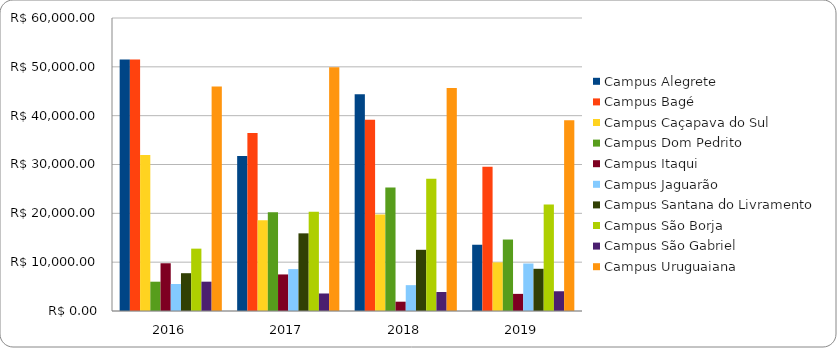
| Category | Campus Alegrete | Campus Bagé | Campus Caçapava do Sul | Campus Dom Pedrito | Campus Itaqui | Campus Jaguarão | Campus Santana do Livramento | Campus São Borja | Campus São Gabriel | Campus Uruguaiana |
|---|---|---|---|---|---|---|---|---|---|---|
| 2016.0 | 51503.28 | 51503.28 | 31923.03 | 6000.3 | 9774.9 | 5524.56 | 7741.78 | 12768.87 | 6005.07 | 45958.79 |
| 2017.0 | 31750.05 | 36445.28 | 18592.67 | 20207.49 | 7486.68 | 8578.61 | 15900.46 | 20317.83 | 3586.74 | 49914.33 |
| 2018.0 | 44397.16 | 39189.39 | 19756.82 | 25306.79 | 1905.09 | 5292.72 | 12533.12 | 27078.19 | 3896 | 45683.34 |
| 2019.0 | 13568.8 | 29555.48 | 9963.19 | 14634.99 | 3506.87 | 9724.73 | 8642.35 | 21789.3 | 4043.11 | 39042.5 |